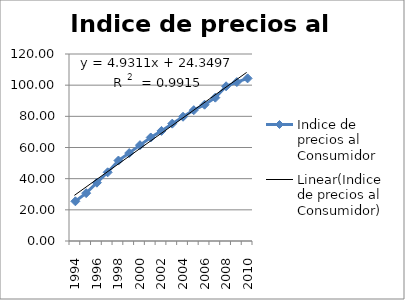
| Category | Indice de precios al Consumidor |
|---|---|
| 1994.0 | 25.479 |
| 1995.0 | 30.707 |
| 1996.0 | 37.423 |
| 1997.0 | 44.085 |
| 1998.0 | 51.621 |
| 1999.0 | 56.432 |
| 2000.0 | 61.503 |
| 2001.0 | 66.427 |
| 2002.0 | 70.655 |
| 2003.0 | 75.307 |
| 2004.0 | 79.748 |
| 2005.0 | 83.95 |
| 2006.0 | 87.464 |
| 2007.0 | 91.98 |
| 2008.0 | 99.283 |
| 2009.0 | 101.98 |
| 2010.0 | 104.36 |